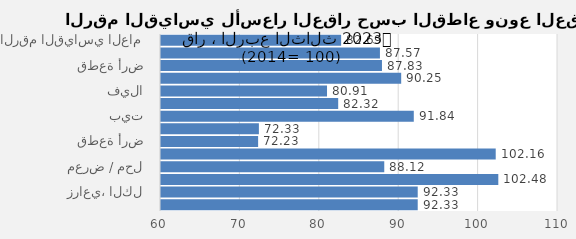
| Category | 2023 |
|---|---|
| الرقم القياسي العام | 82.687 |
| سكني، الكل | 87.574 |
| قطعة أرض | 87.829 |
| عمارة | 90.25 |
| فيلا | 80.909 |
| شقة | 82.317 |
| بيت | 91.837 |
| تجاري، الكل | 72.328 |
| قطعة أرض | 72.232 |
| عمارة | 102.156 |
| معرض / محل | 88.119 |
| مركز تجاري | 102.482 |
| زراعي، الكل | 92.332 |
| أرض زراعية | 92.332 |